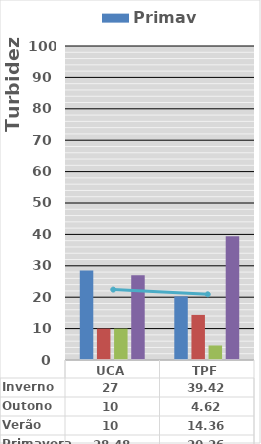
| Category | Primavera | Verão | Outono | Inverno |
|---|---|---|---|---|
| UCA | 28.48 | 10 | 10 | 27 |
| TPF | 20.26 | 14.36 | 4.62 | 39.42 |